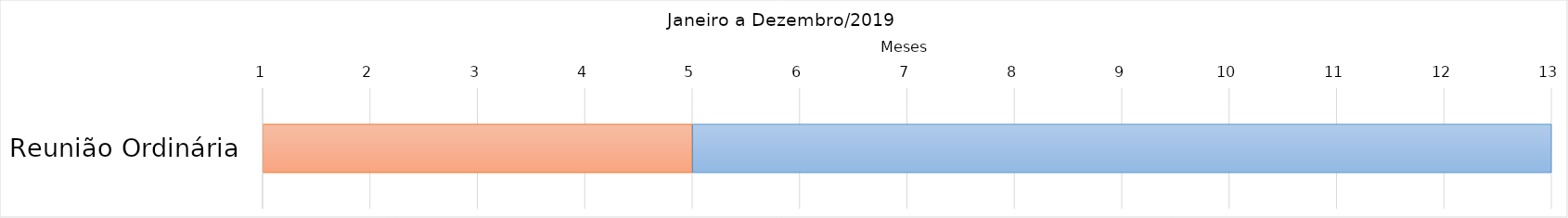
| Category | Início | Duração |
|---|---|---|
| Reunião Ordinária | 5 | 8 |